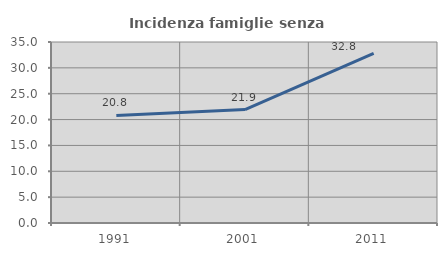
| Category | Incidenza famiglie senza nuclei |
|---|---|
| 1991.0 | 20.794 |
| 2001.0 | 21.936 |
| 2011.0 | 32.788 |